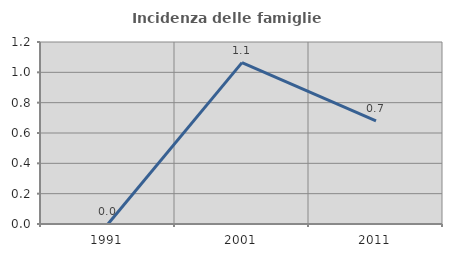
| Category | Incidenza delle famiglie numerose |
|---|---|
| 1991.0 | 0 |
| 2001.0 | 1.064 |
| 2011.0 | 0.68 |